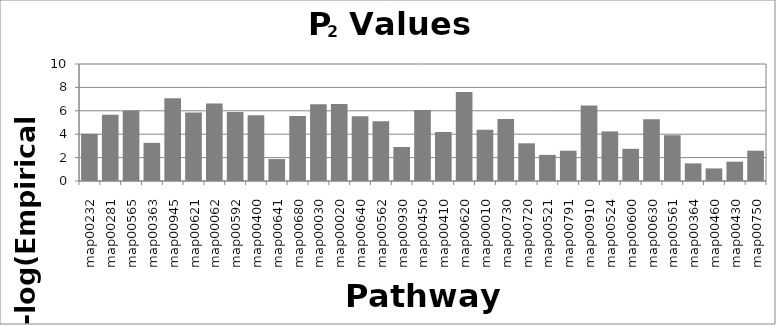
| Category | Series 0 |
|---|---|
| map00232 | 4.034 |
| map00281 | 5.671 |
| map00565 | 6.028 |
| map00363 | 3.263 |
| map00945 | 7.068 |
| map00621 | 5.858 |
| map00062 | 6.618 |
| map00592 | 5.896 |
| map00400 | 5.615 |
| map00641 | 1.873 |
| map00680 | 5.566 |
| map00030 | 6.563 |
| map00020 | 6.591 |
| map00640 | 5.539 |
| map00562 | 5.107 |
| map00930 | 2.904 |
| map00450 | 6.061 |
| map00410 | 4.192 |
| map00620 | 7.6 |
| map00010 | 4.389 |
| map00730 | 5.292 |
| map00720 | 3.224 |
| map00521 | 2.234 |
| map00791 | 2.587 |
| map00910 | 6.461 |
| map00524 | 4.239 |
| map00600 | 2.751 |
| map00630 | 5.275 |
| map00561 | 3.915 |
| map00364 | 1.507 |
| map00460 | 1.075 |
| map00430 | 1.65 |
| map00750 | 2.589 |